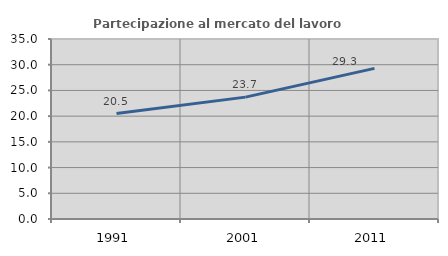
| Category | Partecipazione al mercato del lavoro  femminile |
|---|---|
| 1991.0 | 20.508 |
| 2001.0 | 23.696 |
| 2011.0 | 29.293 |